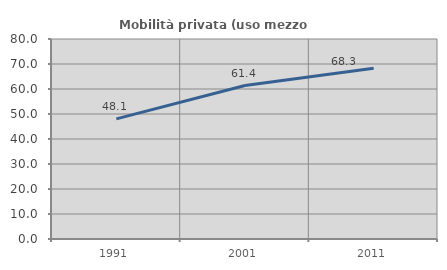
| Category | Mobilità privata (uso mezzo privato) |
|---|---|
| 1991.0 | 48.069 |
| 2001.0 | 61.372 |
| 2011.0 | 68.323 |